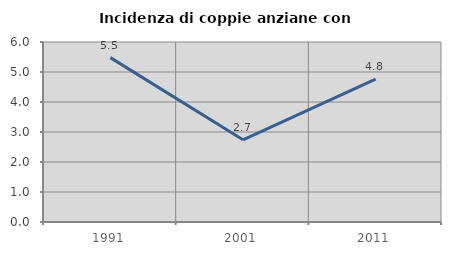
| Category | Incidenza di coppie anziane con figli |
|---|---|
| 1991.0 | 5.479 |
| 2001.0 | 2.74 |
| 2011.0 | 4.762 |